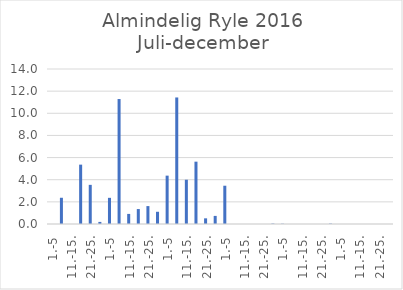
| Category | Series 0 |
|---|---|
| 1.-5 | 0 |
| 6.-10. | 2.37 |
| 11.-15. | 0 |
| 16.-20. | 5.362 |
| 21.-25. | 3.536 |
| 26.-31. | 0.188 |
| 1.-5 | 2.363 |
| 6.-10. | 11.287 |
| 11.-15. | 0.911 |
| 16.-20. | 1.35 |
| 21.-25. | 1.618 |
| 26.-31. | 1.104 |
| 1.-5 | 4.368 |
| 6.-10. | 11.429 |
| 11.-15. | 4 |
| 16.-20. | 5.63 |
| 21.-25. | 0.512 |
| 26.-30. | 0.731 |
| 1.-5 | 3.457 |
| 6.-10. | 0 |
| 11.-15. | 0 |
| 16.-20. | 0 |
| 21.-25. | 0 |
| 26.-31. | 0.036 |
| 1.-5 | 0.023 |
| 6.-10. | 0 |
| 11.-15. | 0 |
| 16.-20. | 0 |
| 21.-25. | 0 |
| 26.-30. | 0.033 |
| 1.-5 | 0 |
| 6.-10. | 0 |
| 11.-15. | 0 |
| 16.-20. | 0 |
| 21.-25. | 0 |
| 26.-31. | 0 |